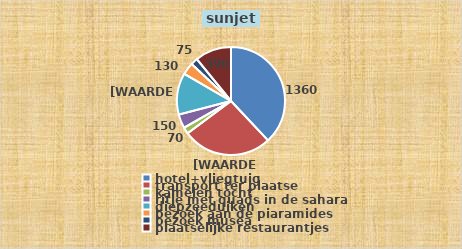
| Category | Series 0 | Series 1 |
|---|---|---|
| hotel+vliegtuig |  | 1360 |
| transport ter plaatse |  | 960 |
| kamelen tocht  |  | 70 |
| ritje met quads in de sahara |  | 150 |
| diepzeeduiken |  | 445 |
| bezoek aan de piaramides |  | 130 |
| bezoek musea |  | 75 |
| plaatselijke restaurantjes |  | 390 |